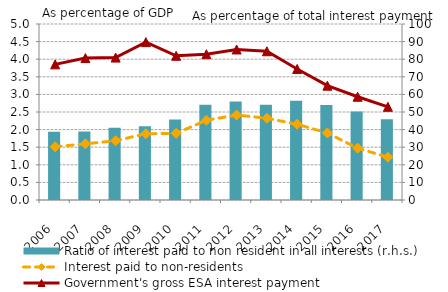
| Category | Ratio of interest paid to non resident in all interests (r.h.s.) |
|---|---|
| 2006.0 | 38.734 |
| 2007.0 | 38.919 |
| 2008.0 | 41.069 |
| 2009.0 | 41.833 |
| 2010.0 | 45.737 |
| 2011.0 | 54.17 |
| 2012.0 | 56.012 |
| 2013.0 | 54.062 |
| 2014.0 | 56.448 |
| 2015.0 | 53.997 |
| 2016.0 | 50.246 |
| 2017.0 | 45.914 |